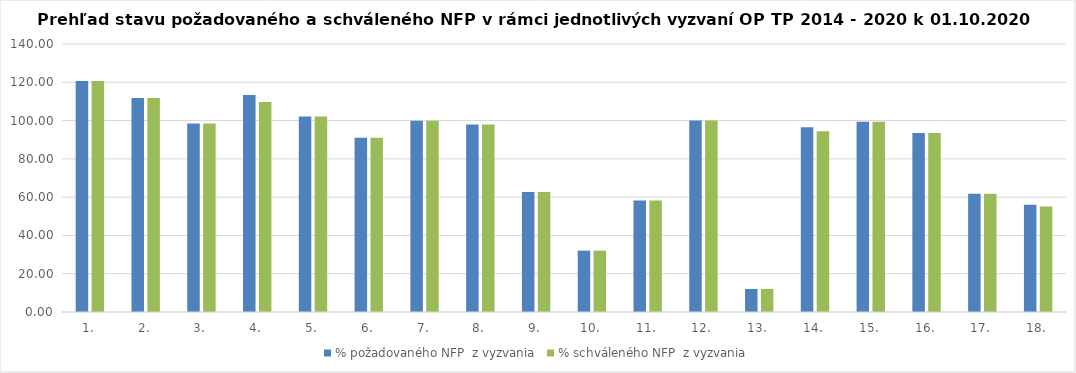
| Category | % požadovaného NFP  z vyzvania | % schváleného NFP  z vyzvania |
|---|---|---|
| 1. | 120.662 | 120.662 |
| 2. | 111.83 | 111.83 |
| 3. | 98.465 | 98.465 |
| 4. | 113.295 | 109.758 |
| 5. | 102.19 | 102.19 |
| 6. | 91.016 | 91.016 |
| 7. | 99.954 | 99.954 |
| 8. | 97.989 | 97.989 |
| 9. | 62.721 | 62.721 |
| 10. | 32.038 | 32.038 |
| 11. | 58.283 | 58.283 |
| 12. | 99.995 | 99.995 |
| 13. | 12.008 | 12.008 |
| 14. | 96.559 | 94.372 |
| 15. | 99.394 | 99.394 |
| 16. | 93.51 | 93.51 |
| 17. | 61.754 | 61.754 |
| 18. | 56.052 | 55.063 |